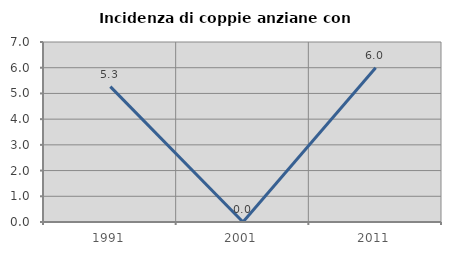
| Category | Incidenza di coppie anziane con figli |
|---|---|
| 1991.0 | 5.263 |
| 2001.0 | 0 |
| 2011.0 | 6 |